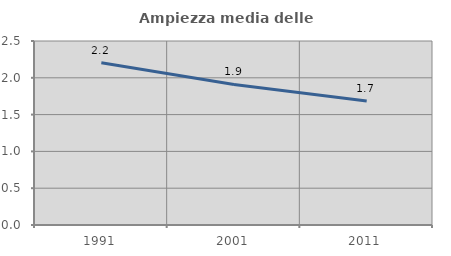
| Category | Ampiezza media delle famiglie |
|---|---|
| 1991.0 | 2.204 |
| 2001.0 | 1.909 |
| 2011.0 | 1.686 |